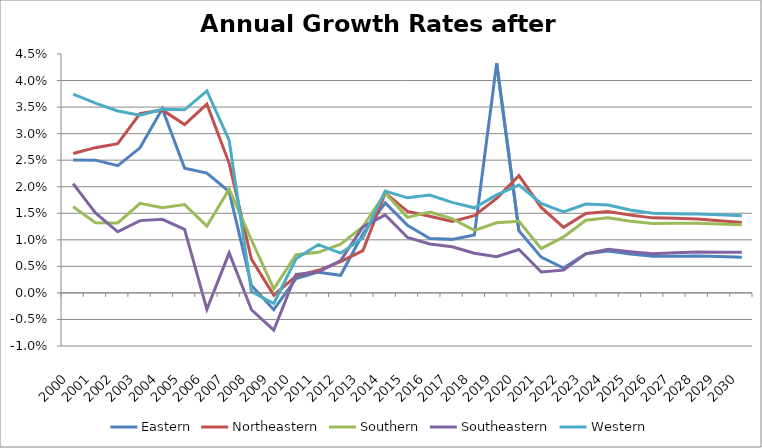
| Category | Eastern | Northeastern | Southern | Southeastern | Western |
|---|---|---|---|---|---|
| 2000.0 | 0.025 | 0.026 | 0.016 | 0.021 | 0.037 |
| 2001.0 | 0.025 | 0.027 | 0.013 | 0.015 | 0.036 |
| 2002.0 | 0.024 | 0.028 | 0.013 | 0.012 | 0.034 |
| 2003.0 | 0.027 | 0.034 | 0.017 | 0.014 | 0.033 |
| 2004.0 | 0.035 | 0.034 | 0.016 | 0.014 | 0.035 |
| 2005.0 | 0.023 | 0.032 | 0.017 | 0.012 | 0.034 |
| 2006.0 | 0.023 | 0.036 | 0.013 | -0.003 | 0.038 |
| 2007.0 | 0.019 | 0.024 | 0.02 | 0.008 | 0.029 |
| 2008.0 | 0.001 | 0.006 | 0.01 | -0.003 | 0 |
| 2009.0 | -0.003 | 0 | 0.001 | -0.007 | -0.002 |
| 2010.0 | 0.003 | 0.003 | 0.007 | 0.004 | 0.006 |
| 2011.0 | 0.004 | 0.004 | 0.008 | 0.004 | 0.009 |
| 2012.0 | 0.003 | 0.006 | 0.009 | 0.006 | 0.007 |
| 2013.0 | 0.011 | 0.008 | 0.012 | 0.012 | 0.01 |
| 2014.0 | 0.017 | 0.019 | 0.019 | 0.015 | 0.019 |
| 2015.0 | 0.013 | 0.015 | 0.014 | 0.01 | 0.018 |
| 2016.0 | 0.01 | 0.014 | 0.015 | 0.009 | 0.018 |
| 2017.0 | 0.01 | 0.013 | 0.014 | 0.009 | 0.017 |
| 2018.0 | 0.011 | 0.015 | 0.012 | 0.007 | 0.016 |
| 2019.0 | 0.043 | 0.018 | 0.013 | 0.007 | 0.018 |
| 2020.0 | 0.012 | 0.022 | 0.014 | 0.008 | 0.02 |
| 2021.0 | 0.007 | 0.016 | 0.008 | 0.004 | 0.017 |
| 2022.0 | 0.005 | 0.012 | 0.011 | 0.004 | 0.015 |
| 2023.0 | 0.007 | 0.015 | 0.014 | 0.007 | 0.017 |
| 2024.0 | 0.008 | 0.015 | 0.014 | 0.008 | 0.017 |
| 2025.0 | 0.007 | 0.015 | 0.014 | 0.008 | 0.016 |
| 2026.0 | 0.007 | 0.014 | 0.013 | 0.007 | 0.015 |
| 2027.0 | 0.007 | 0.014 | 0.013 | 0.008 | 0.015 |
| 2028.0 | 0.007 | 0.014 | 0.013 | 0.008 | 0.015 |
| 2029.0 | 0.007 | 0.014 | 0.013 | 0.008 | 0.015 |
| 2030.0 | 0.007 | 0.013 | 0.013 | 0.008 | 0.015 |